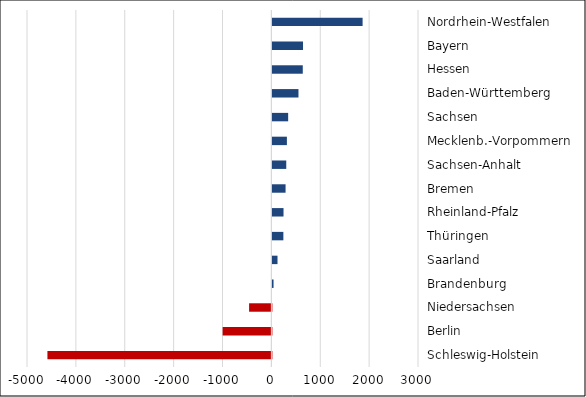
| Category | Series 0 |
|---|---|
| Schleswig-Holstein | -4582 |
| Berlin | -997 |
| Niedersachsen | -456 |
| Brandenburg | 24 |
| Saarland | 105 |
| Thüringen | 225 |
| Rheinland-Pfalz | 228 |
| Bremen | 270 |
| Sachsen-Anhalt | 284 |
| Mecklenb.-Vorpommern | 297 |
| Sachsen | 323 |
| Baden-Württemberg | 534 |
| Hessen | 622 |
| Bayern | 627 |
| Nordrhein-Westfalen | 1846 |